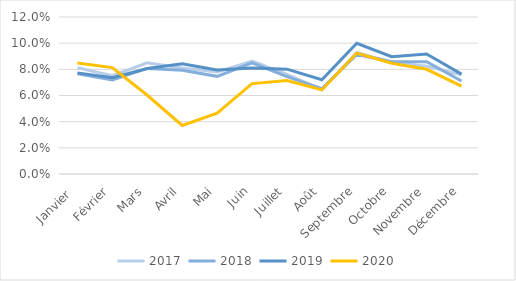
| Category | 2017 | 2018 | 2019 | 2020 |
|---|---|---|---|---|
| Janvier  | 0.081 | 0.077 | 0.077 | 0.085 |
| Février | 0.075 | 0.072 | 0.074 | 0.081 |
| Mars | 0.085 | 0.081 | 0.081 | 0.06 |
| Avril | 0.081 | 0.079 | 0.084 | 0.037 |
| Mai | 0.078 | 0.075 | 0.08 | 0.046 |
| Juin | 0.086 | 0.085 | 0.081 | 0.069 |
| Juillet | 0.076 | 0.074 | 0.08 | 0.071 |
| Août | 0.064 | 0.065 | 0.072 | 0.064 |
| Septembre | 0.093 | 0.091 | 0.1 | 0.092 |
| Octobre | 0.085 | 0.086 | 0.09 | 0.085 |
| Novembre | 0.082 | 0.086 | 0.092 | 0.08 |
| Décembre | 0.076 | 0.071 | 0.076 | 0.067 |